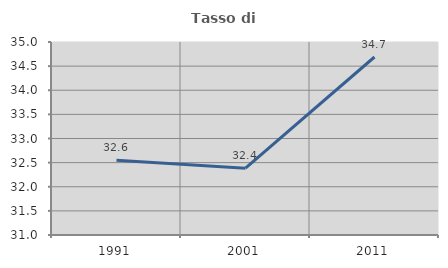
| Category | Tasso di occupazione   |
|---|---|
| 1991.0 | 32.551 |
| 2001.0 | 32.385 |
| 2011.0 | 34.689 |